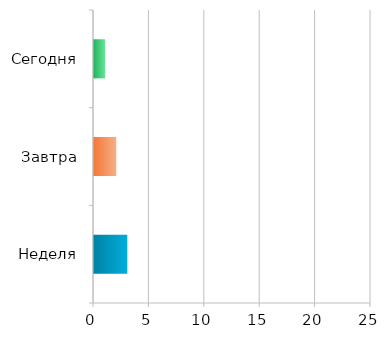
| Category | Series 0 |
|---|---|
| Неделя | 3 |
| Завтра | 2 |
| Сегодня | 1 |